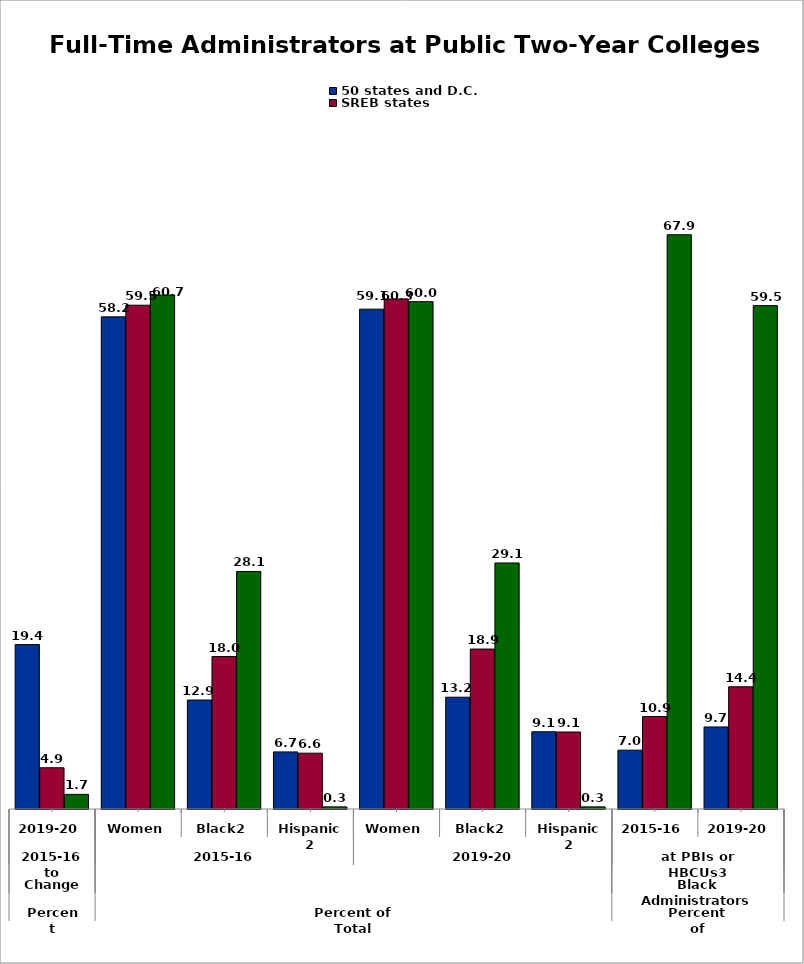
| Category | 50 states and D.C. | SREB states | State |
|---|---|---|---|
| 0 | 19.428 | 4.873 | 1.728 |
| 1 | 58.157 | 59.533 | 60.741 |
| 2 | 12.875 | 18.016 | 28.07 |
| 3 | 6.748 | 6.597 | 0.251 |
| 4 | 59.066 | 60.269 | 59.951 |
| 5 | 13.21 | 18.899 | 29.073 |
| 6 | 9.126 | 9.096 | 0.251 |
| 7 | 6.951 | 10.921 | 67.857 |
| 8 | 9.694 | 14.442 | 59.483 |